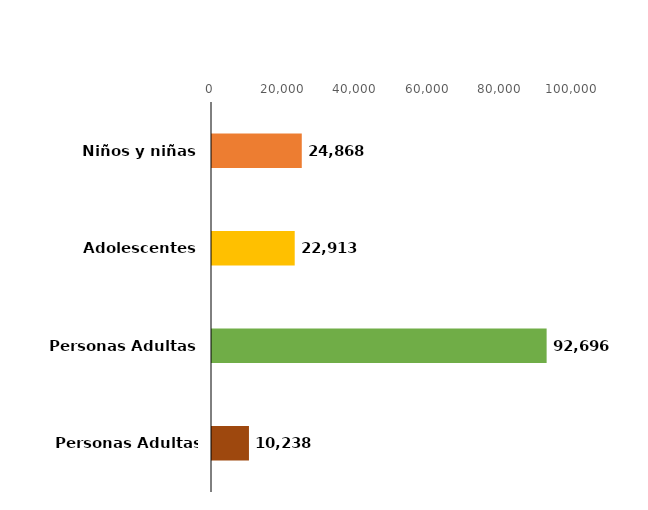
| Category | Series 0 |
|---|---|
| 0 | 24868 |
| 1 | 22913 |
| 2 | 92696 |
| 3 | 10238 |